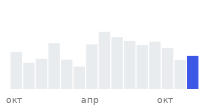
| Category | Продажи всего | Последний месяц |
|---|---|---|
| окт | 123826.123 |  |
|  | 87659.184 |  |
|  | 100626.306 |  |
|  | 152784.842 |  |
|  | 97592.773 |  |
|  | 74904.628 |  |
| апр | 148365.468 |  |
|  | 190622.404 |  |
|  | 173013.93 |  |
|  | 160302.338 |  |
|  | 146655.086 |  |
|  | 157628.49 |  |
| окт | 136203.127 |  |